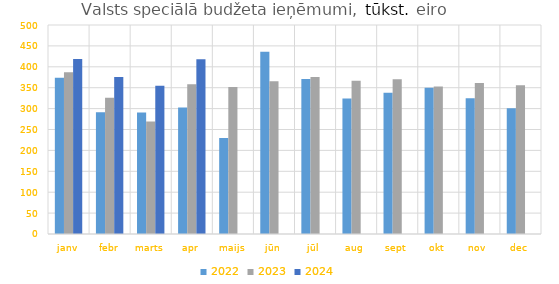
| Category | 2022 | 2023 | 2024 |
|---|---|---|---|
| janv | 373920.799 | 386755.586 | 418920.08 |
| febr | 291303.596 | 325763.822 | 375519.649 |
| marts | 290859.027 | 269347.904 | 354904.037 |
| apr | 302459.796 | 358546.386 | 418219.88 |
| maijs | 229777.32 | 351917.303 | 0 |
| jūn | 435953.091 | 365282.092 | 0 |
| jūl | 370694.27 | 375551.062 | 0 |
| aug | 324382.079 | 366816.511 | 0 |
| sept | 337952.536 | 370049.791 | 0 |
| okt | 349920.822 | 352599.457 | 0 |
| nov | 324970.324 | 361097.134 | 0 |
| dec | 300963.059 | 355952.142 | 0 |